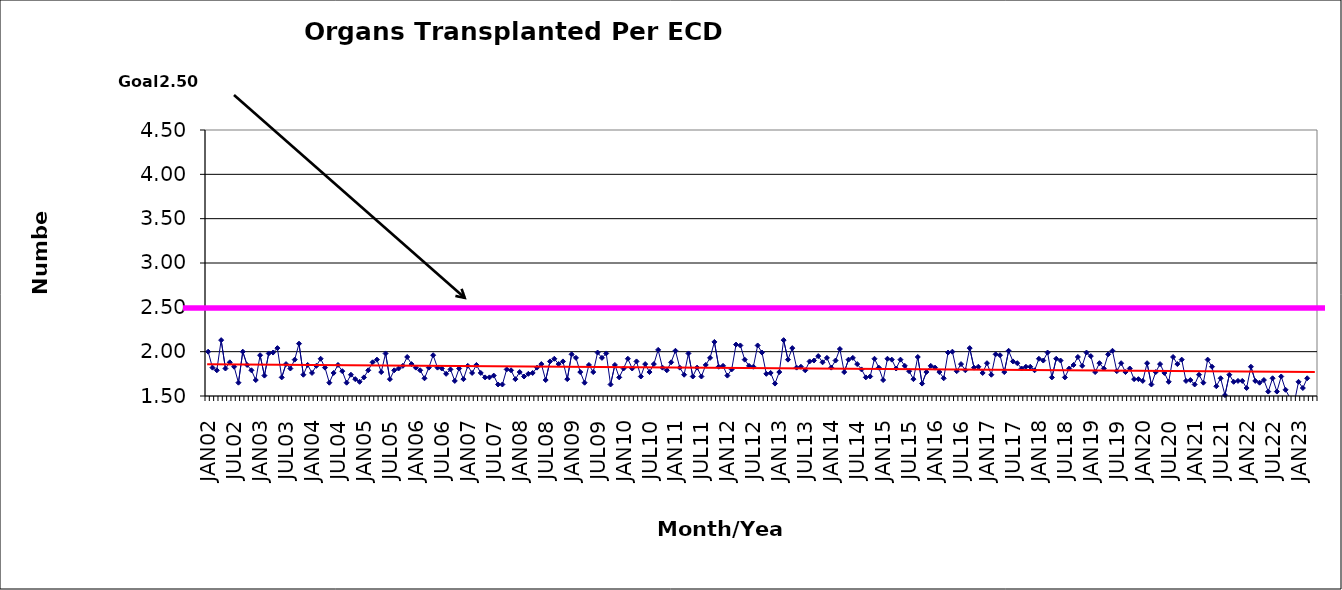
| Category | Series 0 |
|---|---|
| JAN02 | 2 |
| FEB02 | 1.82 |
| MAR02 | 1.79 |
| APR02 | 2.13 |
| MAY02 | 1.81 |
| JUN02 | 1.88 |
| JUL02 | 1.83 |
| AUG02 | 1.65 |
| SEP02 | 2 |
| OCT02 | 1.85 |
| NOV02 | 1.79 |
| DEC02 | 1.68 |
| JAN03 | 1.96 |
| FEB03 | 1.73 |
| MAR03 | 1.98 |
| APR03 | 1.99 |
| MAY03 | 2.04 |
| JUN03 | 1.71 |
| JUL03 | 1.86 |
| AUG03 | 1.81 |
| SEP03 | 1.91 |
| OCT03 | 2.09 |
| NOV03 | 1.74 |
| DEC03 | 1.85 |
| JAN04 | 1.76 |
| FEB04 | 1.84 |
| MAR04 | 1.92 |
| APR04 | 1.82 |
| MAY04 | 1.65 |
| JUN04 | 1.76 |
| JUL04 | 1.85 |
| AUG04 | 1.78 |
| SEP04 | 1.65 |
| OCT04 | 1.74 |
| NOV04 | 1.69 |
| DEC04 | 1.66 |
| JAN05 | 1.71 |
| FEB05 | 1.79 |
| MAR05 | 1.88 |
| APR05 | 1.91 |
| MAY05 | 1.77 |
| JUN05 | 1.98 |
| JUL05 | 1.69 |
| AUG05 | 1.79 |
| SEP05 | 1.81 |
| OCT05 | 1.84 |
| NOV05 | 1.94 |
| DEC05 | 1.86 |
| JAN06 | 1.82 |
| FEB06 | 1.79 |
| MAR06 | 1.7 |
| APR06 | 1.82 |
| MAY06 | 1.96 |
| JUN06 | 1.82 |
| JUL06 | 1.81 |
| AUG06 | 1.75 |
| SEP06 | 1.8 |
| OCT06 | 1.67 |
| NOV06 | 1.81 |
| DEC06 | 1.69 |
| JAN07 | 1.84 |
| FEB07 | 1.76 |
| MAR07 | 1.85 |
| APR07 | 1.76 |
| MAY07 | 1.71 |
| JUN07 | 1.71 |
| JUL07 | 1.73 |
| AUG07 | 1.63 |
| SEP07 | 1.63 |
| OCT07 | 1.8 |
| NOV07 | 1.79 |
| DEC07 | 1.69 |
| JAN08 | 1.77 |
| FEB08 | 1.72 |
| MAR08 | 1.75 |
| APR08 | 1.76 |
| MAY08 | 1.82 |
| JUN08 | 1.86 |
| JUL08 | 1.68 |
| AUG08 | 1.89 |
| SEP08 | 1.92 |
| OCT08 | 1.86 |
| NOV08 | 1.89 |
| DEC08 | 1.69 |
| JAN09 | 1.97 |
| FEB09 | 1.93 |
| MAR09 | 1.77 |
| APR09 | 1.65 |
| MAY09 | 1.85 |
| JUN09 | 1.77 |
| JUL09 | 1.99 |
| AUG09 | 1.93 |
| SEP09 | 1.98 |
| OCT09 | 1.63 |
| NOV09 | 1.85 |
| DEC09 | 1.71 |
| JAN10 | 1.81 |
| FEB10 | 1.92 |
| MAR10 | 1.81 |
| APR10 | 1.89 |
| MAY10 | 1.72 |
| JUN10 | 1.86 |
| JUL10 | 1.77 |
| AUG10 | 1.86 |
| SEP10 | 2.02 |
| OCT10 | 1.82 |
| NOV10 | 1.79 |
| DEC10 | 1.88 |
| JAN11 | 2.01 |
| FEB11 | 1.82 |
| MAR11 | 1.74 |
| APR11 | 1.98 |
| MAY11 | 1.72 |
| JUN11 | 1.82 |
| JUL11 | 1.72 |
| AUG11 | 1.85 |
| SEP11 | 1.93 |
| OCT11 | 2.11 |
| NOV11 | 1.83 |
| DEC11 | 1.84 |
| JAN12 | 1.73 |
| FEB12 | 1.8 |
| MAR12 | 2.08 |
| APR12 | 2.07 |
| MAY12 | 1.91 |
| JUN12 | 1.84 |
| JUL12 | 1.83 |
| AUG12 | 2.07 |
| SEP12 | 1.99 |
| OCT12 | 1.75 |
| NOV12 | 1.76 |
| DEC12 | 1.64 |
| JAN13 | 1.77 |
| FEB13 | 2.13 |
| MAR13 | 1.91 |
| APR13 | 2.04 |
| MAY13 | 1.82 |
| JUN13 | 1.83 |
| JUL13 | 1.79 |
| AUG13 | 1.89 |
| SEP13 | 1.9 |
| OCT13 | 1.95 |
| NOV13 | 1.88 |
| DEC13 | 1.93 |
| JAN14 | 1.82 |
| FEB14 | 1.9 |
| MAR14 | 2.03 |
| APR14 | 1.77 |
| MAY14 | 1.91 |
| JUN14 | 1.93 |
| JUL14 | 1.86 |
| AUG14 | 1.8 |
| SEP14 | 1.71 |
| OCT14 | 1.72 |
| NOV14 | 1.92 |
| DEC14 | 1.82 |
| JAN15 | 1.68 |
| FEB15 | 1.92 |
| MAR15 | 1.91 |
| APR15 | 1.81 |
| MAY15 | 1.91 |
| JUN15 | 1.84 |
| JUL15 | 1.78 |
| AUG15 | 1.69 |
| SEP15 | 1.94 |
| OCT15 | 1.64 |
| NOV15 | 1.77 |
| DEC15 | 1.84 |
| JAN16 | 1.82 |
| FEB16 | 1.77 |
| MAR16 | 1.7 |
| APR16 | 1.99 |
| MAY16 | 2 |
| JUN16 | 1.78 |
| JUL16 | 1.86 |
| AUG16 | 1.79 |
| SEP16 | 2.04 |
| OCT16 | 1.82 |
| NOV16 | 1.83 |
| DEC16 | 1.76 |
| JAN17 | 1.87 |
| FEB17 | 1.74 |
| MAR17 | 1.97 |
| APR17 | 1.96 |
| MAY17 | 1.77 |
| JUN17 | 2.01 |
| JUL17 | 1.89 |
| AUG17 | 1.87 |
| SEP17 | 1.81 |
| OCT17 | 1.83 |
| NOV17 | 1.83 |
| DEC17 | 1.79 |
| JAN18 | 1.92 |
| FEB18 | 1.9 |
| MAR18 | 1.99 |
| APR18 | 1.71 |
| MAY18 | 1.92 |
| JUN18 | 1.9 |
| JUL18 | 1.71 |
| AUG18 | 1.81 |
| SEP18 | 1.85 |
| OCT18 | 1.94 |
| NOV18 | 1.84 |
| DEC18 | 1.99 |
| JAN19 | 1.95 |
| FEB19 | 1.77 |
| MAR19 | 1.87 |
| APR19 | 1.81 |
| MAY19 | 1.97 |
| JUN19 | 2.01 |
| JUL19 | 1.78 |
| AUG19 | 1.87 |
| SEP19 | 1.77 |
| OCT19 | 1.81 |
| NOV19 | 1.69 |
| DEC19 | 1.69 |
| JAN20 | 1.67 |
| FEB20 | 1.87 |
| MAR20 | 1.63 |
| APR20 | 1.77 |
| MAY20 | 1.86 |
| JUN20 | 1.76 |
| JUL20 | 1.66 |
| AUG20 | 1.94 |
| SEP20 | 1.86 |
| OCT20 | 1.91 |
| NOV20 | 1.67 |
| DEC20 | 1.68 |
| JAN21 | 1.63 |
| FEB21 | 1.74 |
| MAR21 | 1.65 |
| APR21 | 1.91 |
| MAY21 | 1.83 |
| JUN21 | 1.61 |
| JUL21 | 1.7 |
| AUG21 | 1.51 |
| SEP21 | 1.74 |
| OCT21 | 1.66 |
| NOV21 | 1.67 |
| DEC21 | 1.67 |
| JAN22 | 1.59 |
| FEB22 | 1.83 |
| MAR22 | 1.67 |
| APR22 | 1.65 |
| MAY22 | 1.68 |
| JUN22 | 1.55 |
| JUL22 | 1.7 |
| AUG22 | 1.55 |
| SEP22 | 1.72 |
| OCT22 | 1.57 |
| NOV22 | 1.48 |
| DEC22 | 1.42 |
| JAN23 | 1.66 |
| FEB23 | 1.59 |
| MAR23 | 1.7 |